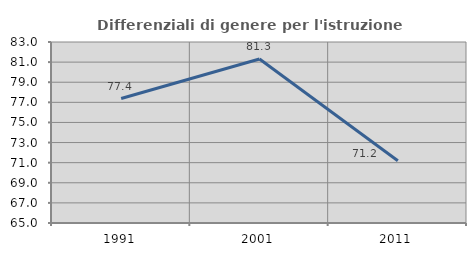
| Category | Differenziali di genere per l'istruzione superiore |
|---|---|
| 1991.0 | 77.378 |
| 2001.0 | 81.311 |
| 2011.0 | 71.185 |